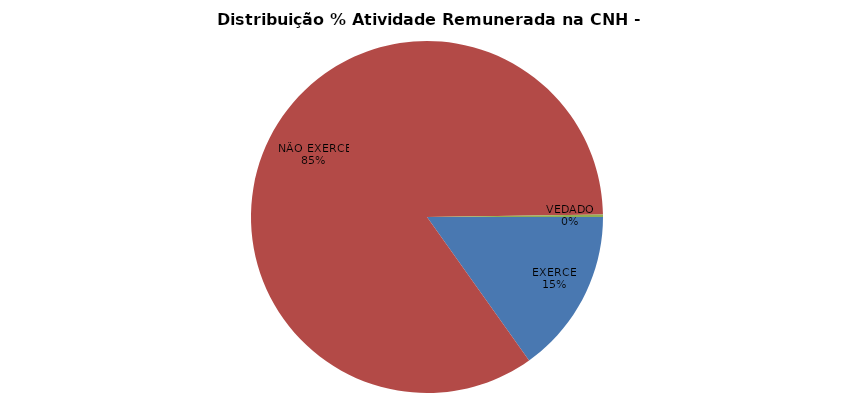
| Category | 2019/Dezembro |
|---|---|
| EXERCE | 767015 |
| NÃO EXERCE | 4283411 |
| VEDADO | 10939 |